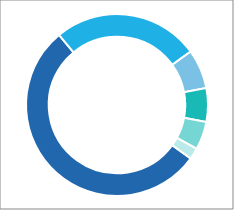
| Category | Series 0 |
|---|---|
| ● Market risk | 0.54 |
| ● Premium & reserve risk | 0.26 |
| ● Business risk | 0.07 |
| ● Natural catastrophe risk | 0.06 |
| ● Life insurance risk | 0.05 |
| ● Other credit risk | 0.02 |